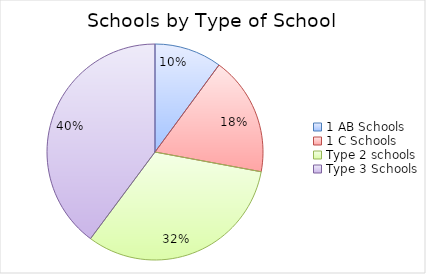
| Category | Series 0 |
|---|---|
| 1 AB Schools | 1029 |
| 1 C Schools | 1818 |
| Type 2 schools | 3288 |
| Type 3 Schools | 4059 |